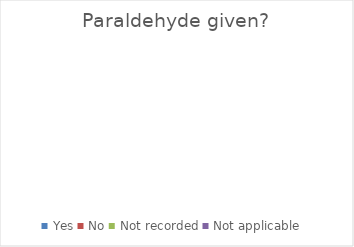
| Category | Series 0 |
|---|---|
| Yes | 0 |
| No | 0 |
| Not recorded | 0 |
| Not applicable | 0 |